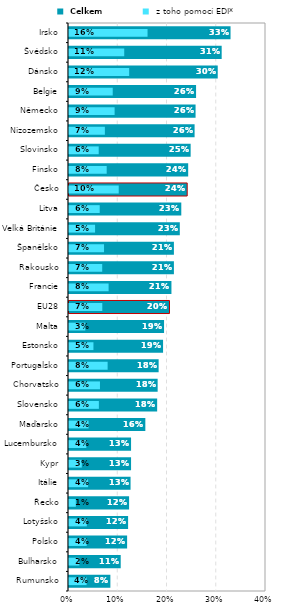
| Category |  Celkem |
|---|---|
| Rumunsko | 0.084 |
| Bulharsko | 0.105 |
| Polsko | 0.118 |
| Lotyšsko | 0.12 |
| Řecko | 0.122 |
| Itálie | 0.125 |
| Kypr | 0.126 |
| Lucembursko | 0.126 |
| Maďarsko | 0.155 |
| Slovensko | 0.179 |
| Chorvatsko | 0.18 |
| Portugalsko | 0.182 |
| Estonsko | 0.191 |
| Malta | 0.193 |
| EU28 | 0.204 |
| Francie | 0.208 |
| Rakousko | 0.213 |
| Španělsko | 0.213 |
| Velká Británie | 0.225 |
| Litva | 0.228 |
| Česko | 0.24 |
| Finsko | 0.242 |
| Slovinsko | 0.247 |
| Nizozemsko | 0.255 |
| Německo | 0.257 |
| Belgie | 0.258 |
| Dánsko | 0.302 |
| Švédsko | 0.31 |
| Irsko | 0.328 |